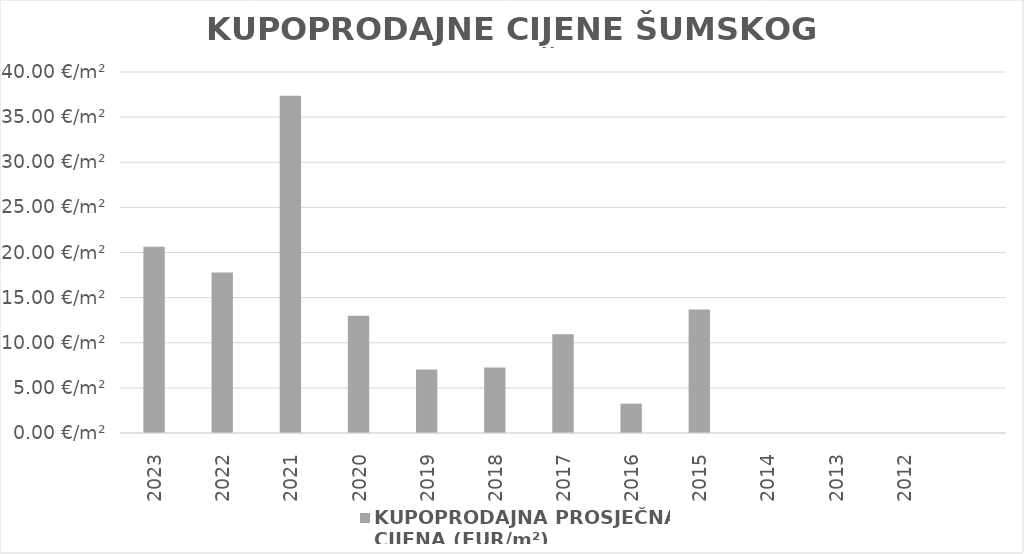
| Category | KUPOPRODAJNA PROSJEČNA 
CIJENA (EUR/m²) |
|---|---|
| 2023 | 1900-01-20 15:32:11 |
| 2022 | 1900-01-17 18:55:45 |
| 2021 | 1900-02-06 08:35:55 |
| 2020 | 1900-01-12 23:32:07 |
| 2019 | 1900-01-07 00:50:46 |
| 2018 | 1900-01-07 06:23:01 |
| 2017 | 1900-01-10 22:28:47 |
| 2016 | 1900-01-03 06:05:16 |
| 2015 | 1900-01-13 16:42:32 |
| 2014 | 0 |
| 2013 | 0 |
| 2012 | 0 |